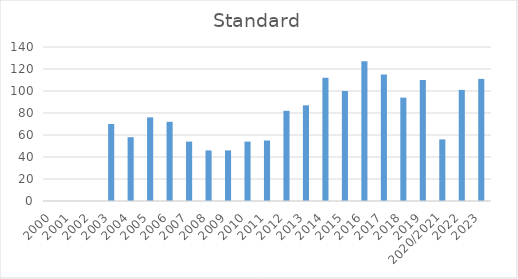
| Category | Standard |
|---|---|
| 2000 | 0 |
| 2001 | 0 |
| 2002 | 0 |
| 2003 | 70 |
| 2004 | 58 |
| 2005 | 76 |
| 2006 | 72 |
| 2007 | 54 |
| 2008 | 46 |
| 2009 | 46 |
| 2010 | 54 |
| 2011 | 55 |
| 2012 | 82 |
| 2013 | 87 |
| 2014 | 112 |
| 2015 | 100 |
| 2016 | 127 |
| 2017 | 115 |
| 2018 | 94 |
| 2019 | 110 |
| 2020/2021 | 56 |
| 2022 | 101 |
| 2023 | 111 |